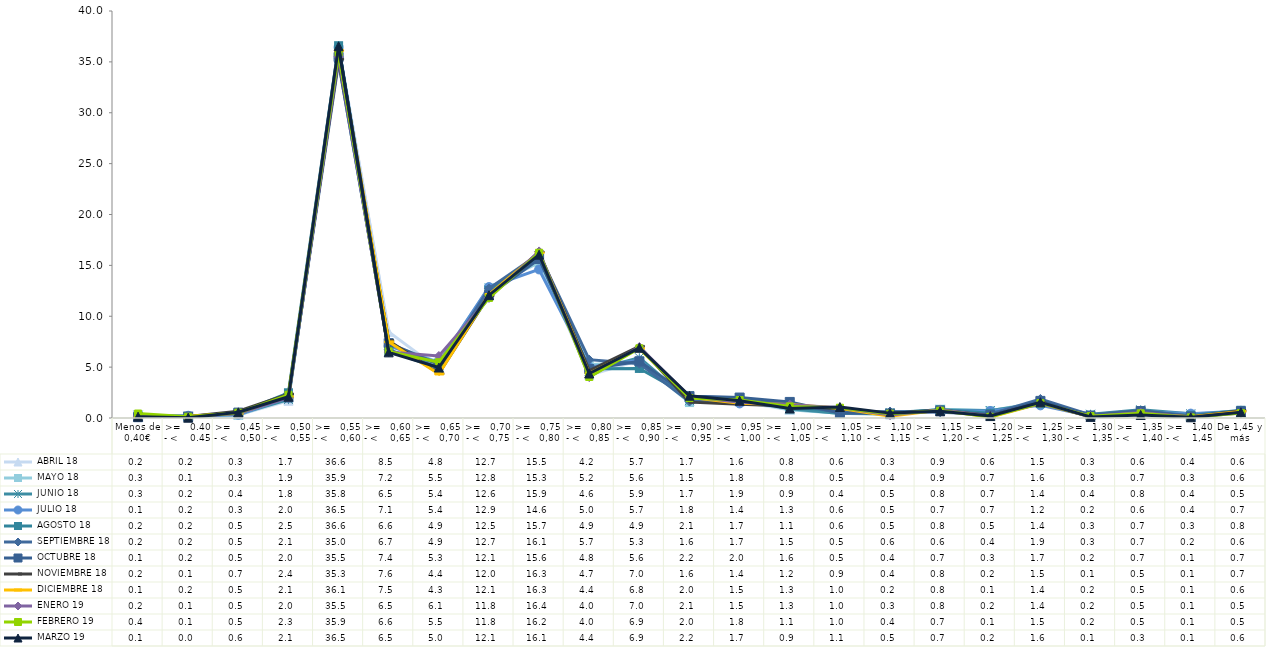
| Category |  ABRIL 18 |  MAYO 18 |  JUNIO 18 |  JULIO 18 |  AGOSTO 18 |  SEPTIEMBRE 18 |  OCTUBRE 18 |  NOVIEMBRE 18 |  DICIEMBRE 18 |  ENERO 19 |  FEBRERO 19 |  MARZO 19 |
|---|---|---|---|---|---|---|---|---|---|---|---|---|
| Menos de 0,40€ | 0.2 | 0.25 | 0.28 | 0.12 | 0.15 | 0.17 | 0.08 | 0.16 | 0.07 | 0.2 | 0.44 | 0.13 |
| >=   0.40 - <    0.45 | 0.16 | 0.11 | 0.17 | 0.22 | 0.15 | 0.15 | 0.15 | 0.14 | 0.18 | 0.08 | 0.12 | 0.03 |
| >=   0,45 - <    0,50 | 0.32 | 0.28 | 0.4 | 0.33 | 0.47 | 0.45 | 0.53 | 0.66 | 0.47 | 0.46 | 0.52 | 0.56 |
| >=   0,50 - <    0,55 | 1.69 | 1.94 | 1.81 | 2.02 | 2.48 | 2.09 | 2.02 | 2.35 | 2.08 | 2 | 2.28 | 2.09 |
| >=   0,55 - <    0,60 | 36.55 | 35.9 | 35.81 | 36.45 | 36.59 | 34.99 | 35.48 | 35.27 | 36.11 | 35.5 | 35.91 | 36.53 |
| >=   0,60 - <    0,65 | 8.46 | 7.24 | 6.54 | 7.09 | 6.6 | 6.71 | 7.36 | 7.6 | 7.48 | 6.48 | 6.55 | 6.45 |
| >=   0,65 - <   0,70 | 4.82 | 5.48 | 5.37 | 5.43 | 4.89 | 4.94 | 5.26 | 4.37 | 4.33 | 6.09 | 5.48 | 4.96 |
| >=   0,70 - <   0,75 | 12.66 | 12.8 | 12.63 | 12.87 | 12.53 | 12.72 | 12.06 | 12.03 | 12.14 | 11.8 | 11.8 | 12.07 |
| >=   0,75 - <   0,80 | 15.48 | 15.29 | 15.89 | 14.6 | 15.68 | 16.11 | 15.63 | 16.31 | 16.26 | 16.37 | 16.24 | 16.05 |
| >=   0,80 - <   0,85 | 4.21 | 5.24 | 4.61 | 5.02 | 4.85 | 5.73 | 4.81 | 4.65 | 4.4 | 4.02 | 4.03 | 4.37 |
| >=   0,85 - <   0,90 | 5.68 | 5.56 | 5.93 | 5.66 | 4.87 | 5.34 | 5.57 | 7.04 | 6.84 | 6.98 | 6.85 | 6.9 |
| >=   0,90 - <    0,95 | 1.67 | 1.52 | 1.71 | 1.79 | 2.1 | 1.62 | 2.15 | 1.56 | 2.04 | 2.1 | 1.96 | 2.19 |
| >=   0,95 - <   1,00 | 1.6 | 1.79 | 1.92 | 1.43 | 1.74 | 1.68 | 2.01 | 1.35 | 1.45 | 1.54 | 1.76 | 1.7 |
| >=   1,00 - <   1,05 | 0.82 | 0.81 | 0.91 | 1.3 | 1.1 | 1.47 | 1.58 | 1.18 | 1.33 | 1.31 | 1.14 | 0.93 |
| >=   1,05 - <    1,10 | 0.55 | 0.46 | 0.44 | 0.63 | 0.64 | 0.52 | 0.5 | 0.9 | 0.95 | 1.02 | 1.01 | 1.08 |
| >=   1,10 - <   1,15 | 0.34 | 0.35 | 0.54 | 0.45 | 0.48 | 0.64 | 0.42 | 0.44 | 0.18 | 0.29 | 0.42 | 0.48 |
| >=   1,15 - <    1,20 | 0.85 | 0.86 | 0.78 | 0.7 | 0.82 | 0.57 | 0.71 | 0.79 | 0.78 | 0.79 | 0.71 | 0.66 |
| >=   1,20 - <    1,25 | 0.55 | 0.71 | 0.73 | 0.69 | 0.46 | 0.38 | 0.3 | 0.23 | 0.09 | 0.2 | 0.12 | 0.19 |
| >=   1,25 - <    1,30 | 1.47 | 1.56 | 1.42 | 1.24 | 1.43 | 1.87 | 1.68 | 1.5 | 1.43 | 1.43 | 1.46 | 1.55 |
| >=   1,30 - <    1,35 | 0.26 | 0.28 | 0.37 | 0.2 | 0.28 | 0.31 | 0.21 | 0.1 | 0.15 | 0.18 | 0.18 | 0.11 |
| >=   1,35 - <    1,40 | 0.64 | 0.67 | 0.81 | 0.63 | 0.68 | 0.73 | 0.68 | 0.5 | 0.45 | 0.53 | 0.46 | 0.3 |
| >=   1,40 - <    1,45 | 0.42 | 0.31 | 0.42 | 0.43 | 0.25 | 0.18 | 0.14 | 0.11 | 0.12 | 0.08 | 0.06 | 0.07 |
| De 1,45 y más | 0.59 | 0.59 | 0.51 | 0.68 | 0.76 | 0.61 | 0.67 | 0.72 | 0.63 | 0.5 | 0.49 | 0.57 |